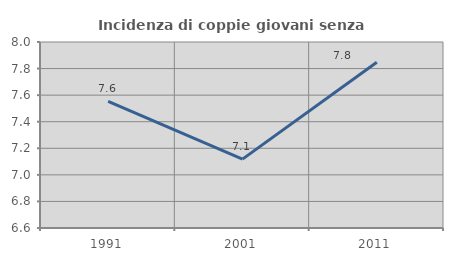
| Category | Incidenza di coppie giovani senza figli |
|---|---|
| 1991.0 | 7.554 |
| 2001.0 | 7.119 |
| 2011.0 | 7.848 |